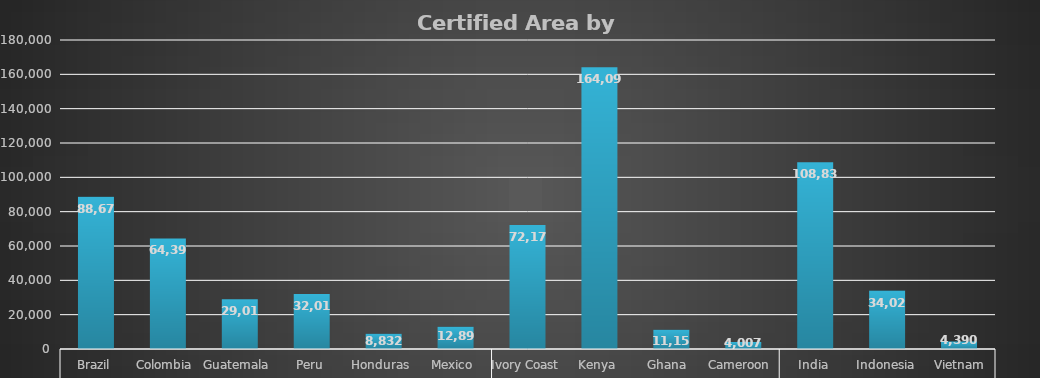
| Category | Oct-22 |
|---|---|
| 0 | 88674 |
| 1 | 64399 |
| 2 | 29019 |
| 3 | 32015 |
| 4 | 8832 |
| 5 | 12894 |
| 6 | 72175 |
| 7 | 164094 |
| 8 | 11155 |
| 9 | 4007 |
| 10 | 108838 |
| 11 | 34024 |
| 12 | 4390 |